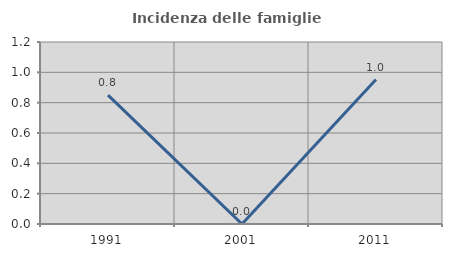
| Category | Incidenza delle famiglie numerose |
|---|---|
| 1991.0 | 0.85 |
| 2001.0 | 0 |
| 2011.0 | 0.952 |